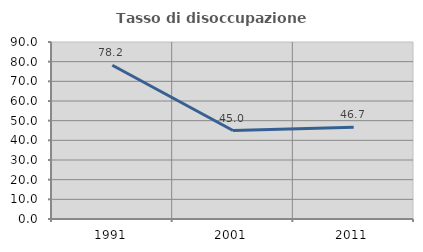
| Category | Tasso di disoccupazione giovanile  |
|---|---|
| 1991.0 | 78.182 |
| 2001.0 | 45 |
| 2011.0 | 46.667 |